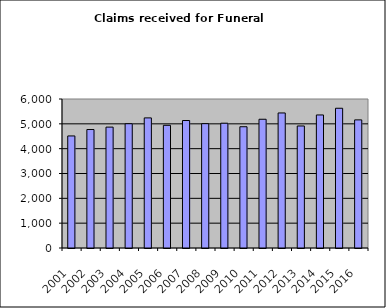
| Category | Series 1 |
|---|---|
| 2001.0 | 4512 |
| 2002.0 | 4771 |
| 2003.0 | 4868 |
| 2004.0 | 5004 |
| 2005.0 | 5239 |
| 2006.0 | 4941 |
| 2007.0 | 5134 |
| 2008.0 | 5007 |
| 2009.0 | 5025 |
| 2010.0 | 4883 |
| 2011.0 | 5184 |
| 2012.0 | 5438 |
| 2013.0 | 4914 |
| 2014.0 | 5357 |
| 2015.0 | 5627 |
| 2016.0 | 5159 |